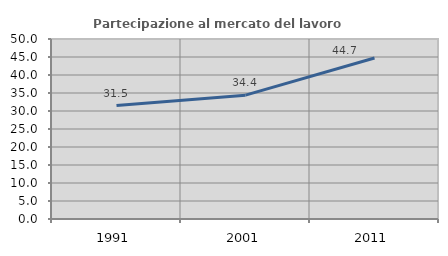
| Category | Partecipazione al mercato del lavoro  femminile |
|---|---|
| 1991.0 | 31.525 |
| 2001.0 | 34.397 |
| 2011.0 | 44.732 |